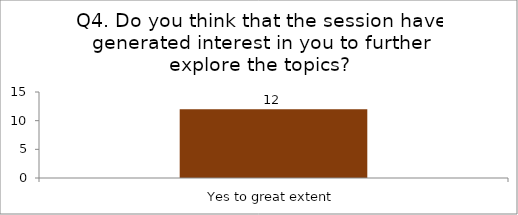
| Category | Q4. Do you think that the session have generated interest in you to further explore the topics? |
|---|---|
| Yes to great extent | 12 |